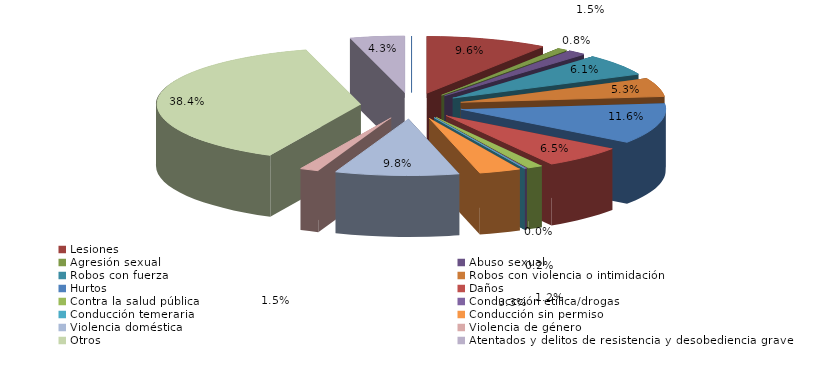
| Category | Series 0 |
|---|---|
| Homicidio/Asesinato dolosos | 0 |
| Lesiones | 58 |
| Agresión sexual | 5 |
| Abuso sexual | 9 |
| Robos con fuerza | 37 |
| Robos con violencia o intimidación | 32 |
| Hurtos | 70 |
| Daños | 39 |
| Contra la salud pública | 7 |
| Conduccción etílica/drogas | 1 |
| Conducción temeraria | 0 |
| Conducción sin permiso | 20 |
| Violencia doméstica | 59 |
| Violencia de género | 9 |
| Otros | 232 |
| Atentados y delitos de resistencia y desobediencia grave | 26 |
| Otros delitos contra el orden público | 0 |